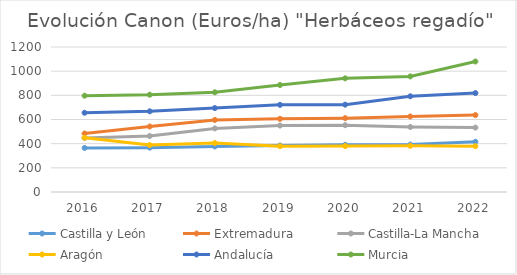
| Category | Castilla y León | Extremadura | Castilla-La Mancha | Aragón | Andalucía | Murcia |
|---|---|---|---|---|---|---|
| 2016.0 | 364.645 | 484.041 | 447.018 | 449.64 | 655.555 | 797 |
| 2017.0 | 367.167 | 542.124 | 463.326 | 388.489 | 667.644 | 805 |
| 2018.0 | 376.942 | 596.338 | 526.224 | 405.348 | 694.596 | 825.13 |
| 2019.0 | 385.101 | 605.581 | 549.947 | 379.256 | 721.333 | 885.44 |
| 2020.0 | 390.858 | 611.205 | 553.016 | 380.166 | 722.958 | 940.684 |
| 2021.0 | 392.411 | 624.958 | 538.073 | 382.196 | 792.047 | 956.536 |
| 2022.0 | 415.664 | 636.829 | 533.215 | 379.087 | 818.709 | 1080 |